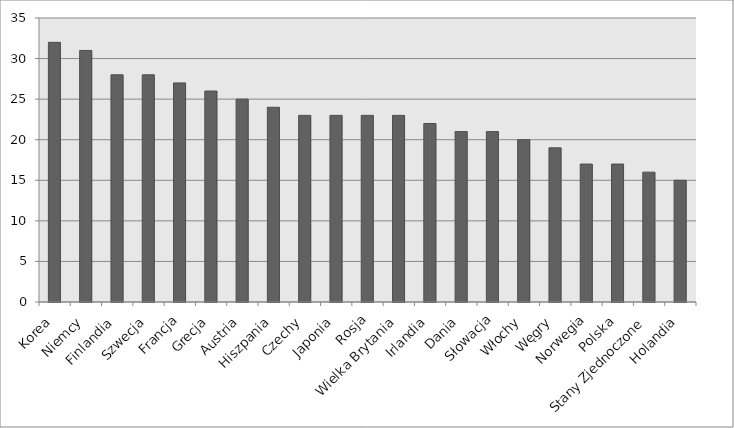
| Category | Udział absolwentów nauk ścisłych i inżynieskich w absolwentach ogółem 2012 (%) |
|---|---|
| Korea | 32 |
| Niemcy | 31 |
| Finlandia | 28 |
| Szwecja | 28 |
| Francja | 27 |
| Grecja | 26 |
| Austria | 25 |
| Hiszpania | 24 |
| Czechy | 23 |
| Japonia | 23 |
| Rosja | 23 |
| Wielka Brytania | 23 |
| Irlandia | 22 |
| Dania | 21 |
| Słowacja | 21 |
| Włochy | 20 |
| Węgry | 19 |
| Norwegia | 17 |
| Polska | 17 |
| Stany Zjednoczone | 16 |
| Holandia | 15 |